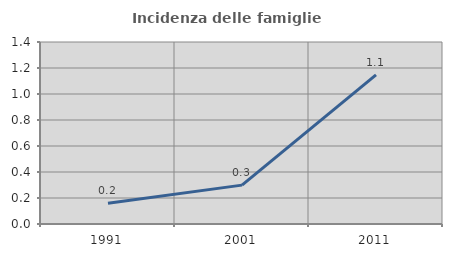
| Category | Incidenza delle famiglie numerose |
|---|---|
| 1991.0 | 0.159 |
| 2001.0 | 0.299 |
| 2011.0 | 1.148 |